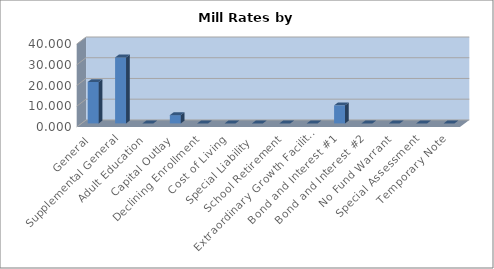
| Category | 2016-2017 |
|---|---|
| General | 20 |
| Supplemental General | 31.833 |
| Adult Education | 0 |
| Capital Outlay | 4 |
| Declining Enrollment | 0 |
| Cost of Living | 0 |
| Special Liability  | 0 |
| School Retirement | 0 |
| Extraordinary Growth Facilities | 0 |
| Bond and Interest #1 | 8.705 |
| Bond and Interest #2 | 0 |
| No Fund Warrant | 0 |
| Special Assessment | 0 |
| Temporary Note | 0 |